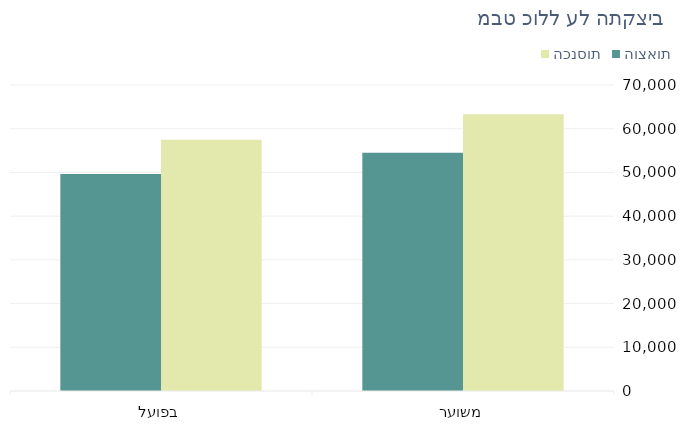
| Category | הכנסות | הוצאות |
|---|---|---|
| משוער | 63300 | 54500 |
| בפועל | 57450 | 49630 |